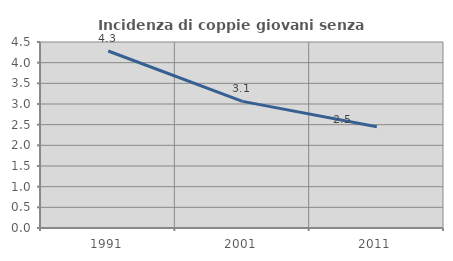
| Category | Incidenza di coppie giovani senza figli |
|---|---|
| 1991.0 | 4.283 |
| 2001.0 | 3.063 |
| 2011.0 | 2.451 |